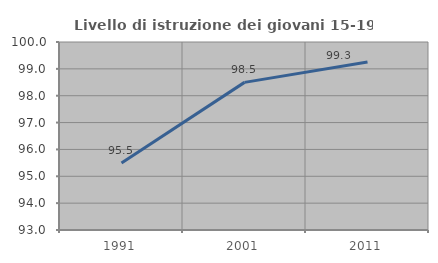
| Category | Livello di istruzione dei giovani 15-19 anni |
|---|---|
| 1991.0 | 95.491 |
| 2001.0 | 98.497 |
| 2011.0 | 99.252 |